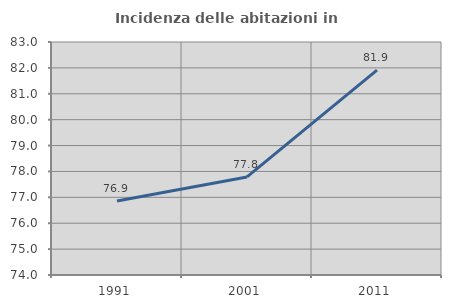
| Category | Incidenza delle abitazioni in proprietà  |
|---|---|
| 1991.0 | 76.861 |
| 2001.0 | 77.789 |
| 2011.0 | 81.916 |